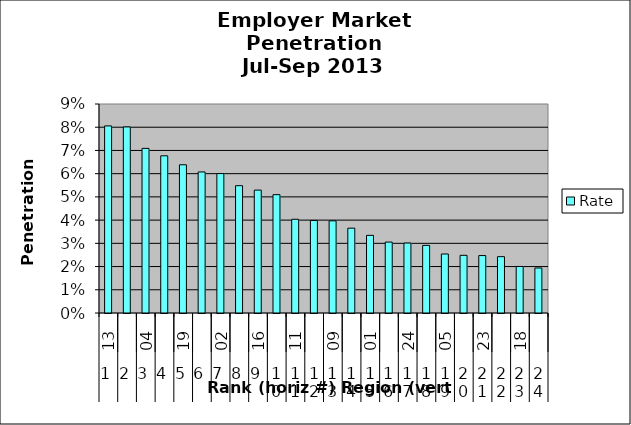
| Category | Rate |
|---|---|
| 0 | 0.081 |
| 1 | 0.08 |
| 2 | 0.071 |
| 3 | 0.068 |
| 4 | 0.064 |
| 5 | 0.061 |
| 6 | 0.06 |
| 7 | 0.055 |
| 8 | 0.053 |
| 9 | 0.051 |
| 10 | 0.04 |
| 11 | 0.04 |
| 12 | 0.04 |
| 13 | 0.037 |
| 14 | 0.033 |
| 15 | 0.031 |
| 16 | 0.03 |
| 17 | 0.029 |
| 18 | 0.025 |
| 19 | 0.025 |
| 20 | 0.025 |
| 21 | 0.024 |
| 22 | 0.02 |
| 23 | 0.019 |